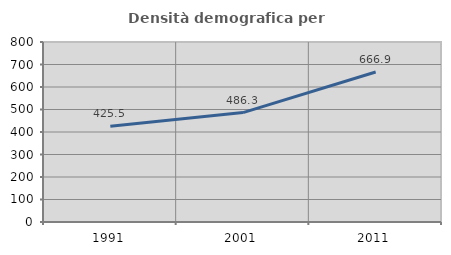
| Category | Densità demografica |
|---|---|
| 1991.0 | 425.451 |
| 2001.0 | 486.292 |
| 2011.0 | 666.911 |